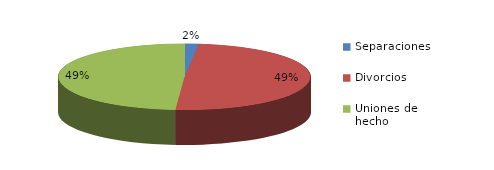
| Category | Series 0 |
|---|---|
| Separaciones | 23 |
| Divorcios | 630 |
| Uniones de hecho | 624 |